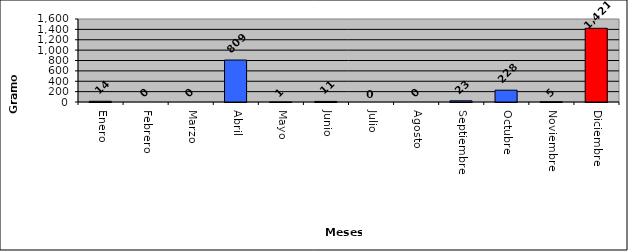
| Category | Extasis |
|---|---|
| Enero | 14 |
| Febrero | 0 |
| Marzo | 0 |
| Abril | 809 |
| Mayo | 1 |
| Junio | 11 |
| Julio | 0 |
| Agosto | 0 |
| Septiembre | 23 |
| Octubre | 228 |
| Noviembre | 5 |
| Diciembre | 1421 |